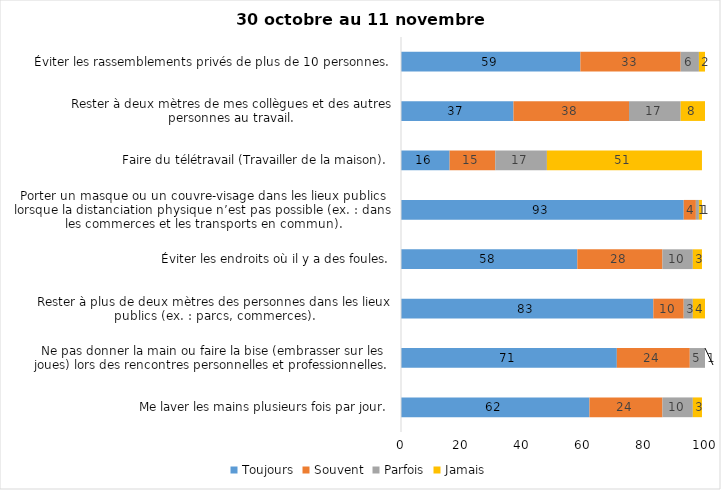
| Category | Toujours | Souvent | Parfois | Jamais |
|---|---|---|---|---|
| Me laver les mains plusieurs fois par jour. | 62 | 24 | 10 | 3 |
| Ne pas donner la main ou faire la bise (embrasser sur les joues) lors des rencontres personnelles et professionnelles. | 71 | 24 | 5 | 1 |
| Rester à plus de deux mètres des personnes dans les lieux publics (ex. : parcs, commerces). | 83 | 10 | 3 | 4 |
| Éviter les endroits où il y a des foules. | 58 | 28 | 10 | 3 |
| Porter un masque ou un couvre-visage dans les lieux publics lorsque la distanciation physique n’est pas possible (ex. : dans les commerces et les transports en commun). | 93 | 4 | 1 | 1 |
| Faire du télétravail (Travailler de la maison). | 16 | 15 | 17 | 51 |
| Rester à deux mètres de mes collègues et des autres personnes au travail. | 37 | 38 | 17 | 8 |
| Éviter les rassemblements privés de plus de 10 personnes. | 59 | 33 | 6 | 2 |